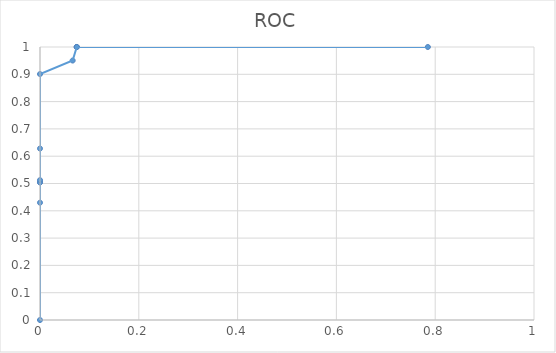
| Category | Series 0 |
|---|---|
| 0.0 | 0 |
| 0.0 | 0.43 |
| 0.0 | 0.504 |
| 0.0 | 0.504 |
| 0.0 | 0.512 |
| 0.0 | 0.628 |
| 0.0 | 0.901 |
| 0.0661157024793388 | 0.95 |
| 0.0743801652892562 | 1 |
| 0.0743801652892562 | 1 |
| 0.0743801652892562 | 1 |
| 0.785123966942149 | 1 |